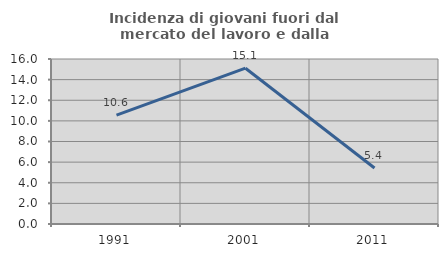
| Category | Incidenza di giovani fuori dal mercato del lavoro e dalla formazione  |
|---|---|
| 1991.0 | 10.563 |
| 2001.0 | 15.108 |
| 2011.0 | 5.435 |